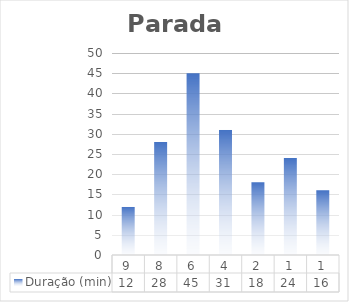
| Category | Duração (min) |
|---|---|
| 9.0 | 12 |
| 8.0 | 28 |
| 6.0 | 45 |
| 4.0 | 31 |
| 2.0 | 18 |
| 1.0 | 24 |
| 1.0 | 16 |